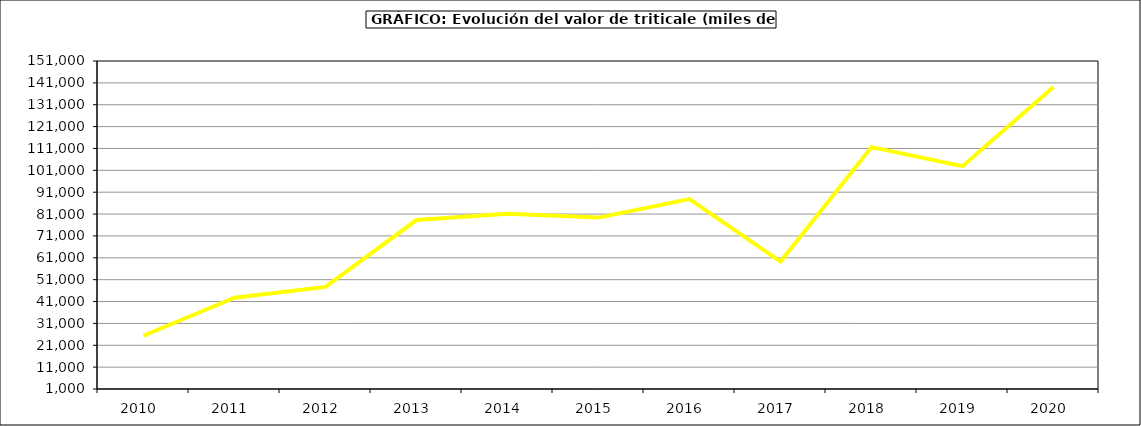
| Category | Producción |
|---|---|
| 2010.0 | 25344.427 |
| 2011.0 | 42728.352 |
| 2012.0 | 47678.033 |
| 2013.0 | 78279.322 |
| 2014.0 | 81166 |
| 2015.0 | 79377 |
| 2016.0 | 87859 |
| 2017.0 | 59282.944 |
| 2018.0 | 111629.892 |
| 2019.0 | 102906.142 |
| 2020.0 | 139092.118 |